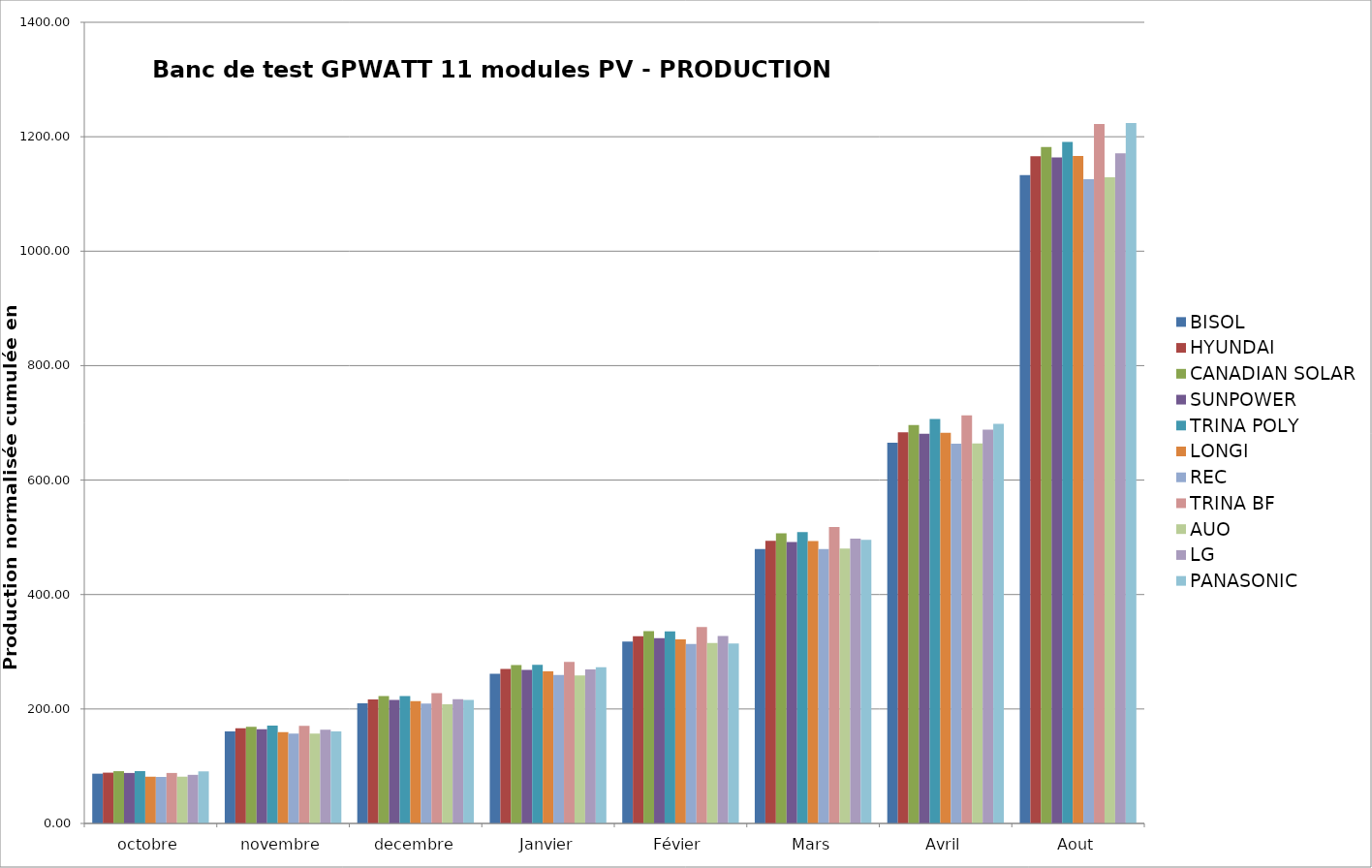
| Category | BISOL | HYUNDAI | CANADIAN SOLAR | SUNPOWER | TRINA POLY | LONGI | REC | TRINA BF | AUO | LG | PANASONIC |
|---|---|---|---|---|---|---|---|---|---|---|---|
| octobre | 86.93 | 88.724 | 91.326 | 88.182 | 91.463 | 81.673 | 81.306 | 88.192 | 81.701 | 84.923 | 90.964 |
| novembre | 160.971 | 166.25 | 168.907 | 164.667 | 171.09 | 159.752 | 157.054 | 170.761 | 156.977 | 163.588 | 160.774 |
| decembre | 209.832 | 216.499 | 222.663 | 215.957 | 222.74 | 213.656 | 209.521 | 227.582 | 208.078 | 216.925 | 215.775 |
| Janvier | 261.691 | 270.193 | 276.726 | 268.146 | 277.26 | 265.599 | 259.555 | 282.332 | 258.568 | 269.07 | 272.892 |
| Févier | 317.746 | 327.332 | 335.98 | 323.935 | 335.725 | 321.79 | 313.76 | 343.297 | 315.177 | 327.771 | 314.294 |
| Mars | 479.616 | 493.87 | 507.025 | 491.902 | 509.326 | 493.303 | 479.5 | 517.905 | 480.416 | 497.616 | 495.618 |
| Avril | 665.468 | 683.378 | 696.396 | 680.864 | 706.6 | 682.783 | 663.655 | 713.229 | 664.015 | 688.319 | 698.096 |
| Aout | 1133.094 | 1165.762 | 1182.04 | 1163.767 | 1190.818 | 1166.286 | 1125.782 | 1222.255 | 1129.131 | 1171.037 | 1223.935 |